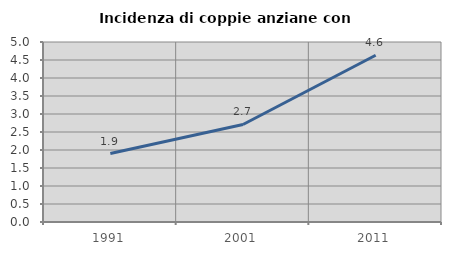
| Category | Incidenza di coppie anziane con figli |
|---|---|
| 1991.0 | 1.902 |
| 2001.0 | 2.709 |
| 2011.0 | 4.633 |